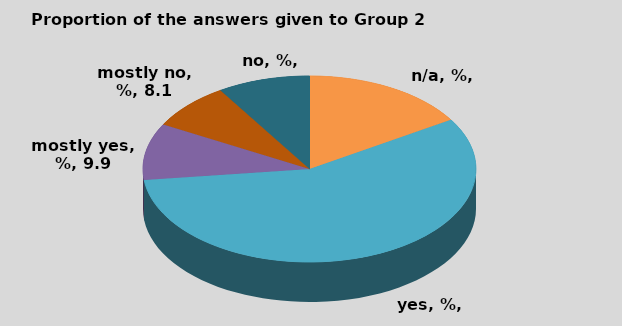
| Category | B2 |
|---|---|
| n/a, % | 16.143 |
| yes, % | 56.951 |
| mostly yes, % | 9.865 |
| mostly no, % | 8.072 |
| no, % | 8.969 |